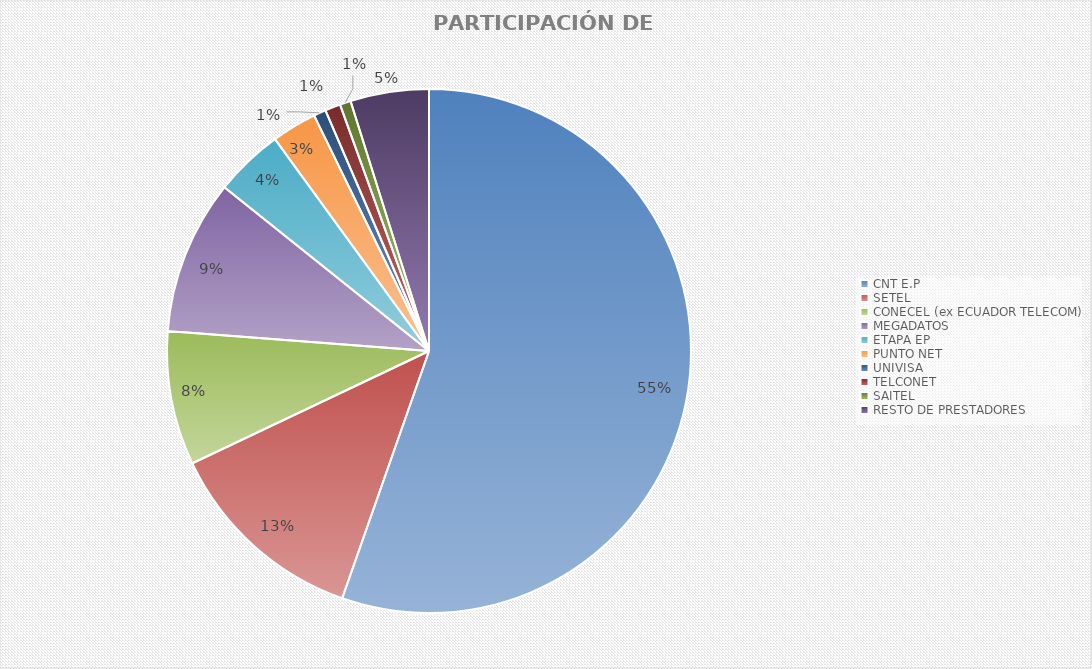
| Category | PARTICIPACIÓN DE MERCADO |
|---|---|
| CNT E.P | 0.554 |
| SETEL | 0.126 |
| CONECEL (ex ECUADOR TELECOM) | 0.083 |
| MEGADATOS | 0.095 |
| ETAPA EP | 0.043 |
| PUNTO NET | 0.028 |
| UNIVISA | 0.008 |
| TELCONET | 0.01 |
| SAITEL | 0.007 |
| RESTO DE PRESTADORES | 0.048 |